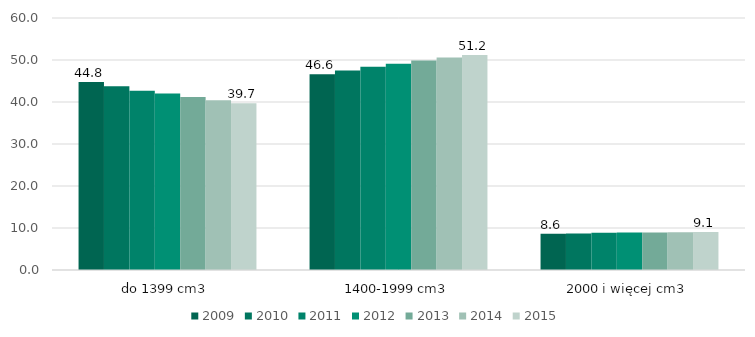
| Category | 2009 | 2010 | 2011 | 2012 | 2013 | 2014 | 2015 |
|---|---|---|---|---|---|---|---|
| do 1399 cm3 | 44.753 | 43.779 | 42.691 | 41.999 | 41.184 | 40.406 | 39.729 |
| 1400-1999 cm3 | 46.631 | 47.508 | 48.411 | 49.085 | 49.885 | 50.591 | 51.22 |
| 2000 i więcej cm3 | 8.616 | 8.713 | 8.898 | 8.916 | 8.931 | 9.004 | 9.051 |